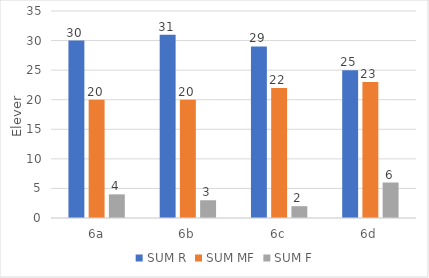
| Category | SUM R | SUM MF | SUM F |
|---|---|---|---|
| 6a | 30 | 20 | 4 |
| 6b | 31 | 20 | 3 |
| 6c | 29 | 22 | 2 |
| 6d | 25 | 23 | 6 |